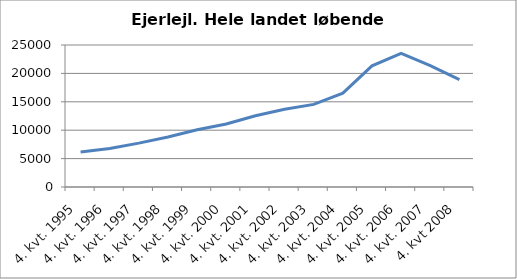
| Category | Ejerlejl. Hele landet løbende priser |
|---|---|
| 4. kvt. 1995 | 6168 |
| 4. kvt. 1996 | 6761 |
| 4. kvt. 1997 | 7726 |
| 4. kvt. 1998 | 8814 |
| 4. kvt. 1999 | 10072 |
| 4. kvt. 2000 | 11087 |
| 4. kvt. 2001 | 12553 |
| 4. kvt. 2002 | 13697 |
| 4. kvt. 2003 | 14547 |
| 4. kvt. 2004 | 16525 |
| 4. kvt. 2005 | 21326 |
| 4. kvt. 2006 | 23522 |
| 4. kvt. 2007 | 21372 |
| 4. kvt 2008 | 18913 |